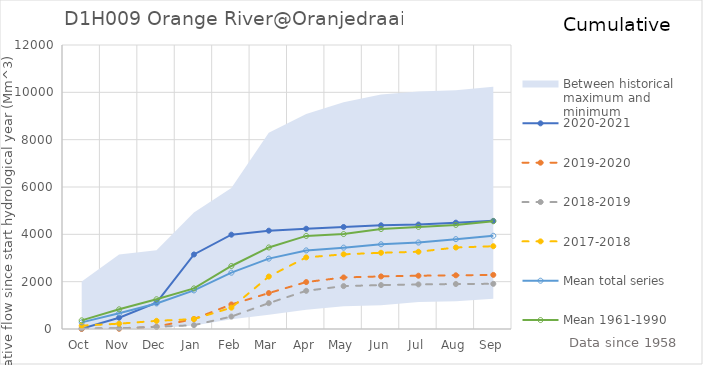
| Category | 2020-2021 | 2019-2020 | 2018-2019 | 2017-2018 | Mean total series | Mean 1961-1990 |
|---|---|---|---|---|---|---|
| Oct | 14.604 | 2.158 | 25.135 | 142.581 | 279.626 | 365.06 |
| Nov | 477.705 | 9.5 | 31.466 | 224.993 | 662.861 | 830.934 |
| Dec | 1116.401 | 99.014 | 92.702 | 344.769 | 1080.037 | 1257.416 |
| Jan | 3148.705 | 422.682 | 161.659 | 418.363 | 1630.637 | 1715.907 |
| Feb | 3985.328 | 1036.673 | 525.529 | 901.213 | 2379.427 | 2662.279 |
| Mar | 4153.15 | 1518.029 | 1092.727 | 2216.535 | 2973.691 | 3445.305 |
| Apr | 4236.345 | 1983.314 | 1613.451 | 3025.553 | 3320.986 | 3933.425 |
| May | 4311.006 | 2177.771 | 1813.049 | 3155.197 | 3437.74 | 4011.762 |
| Jun | 4381.983 | 2221.748 | 1855.619 | 3220.898 | 3579.18 | 4224.145 |
| Jul | 4412.827 | 2251.326 | 1884.28 | 3263.51 | 3654.293 | 4313.834 |
| Aug | 4492.821 | 2268.615 | 1900.854 | 3443.502 | 3797.167 | 4399.141 |
| Sep | 4568.966 | 2286.092 | 1908.666 | 3497.621 | 3938.6 | 4551.917 |